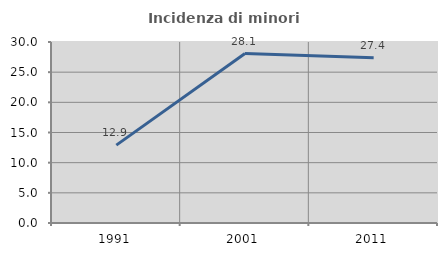
| Category | Incidenza di minori stranieri |
|---|---|
| 1991.0 | 12.903 |
| 2001.0 | 28.085 |
| 2011.0 | 27.376 |